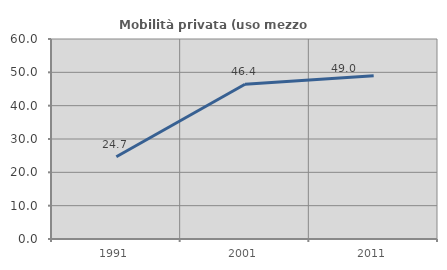
| Category | Mobilità privata (uso mezzo privato) |
|---|---|
| 1991.0 | 24.661 |
| 2001.0 | 46.419 |
| 2011.0 | 48.99 |